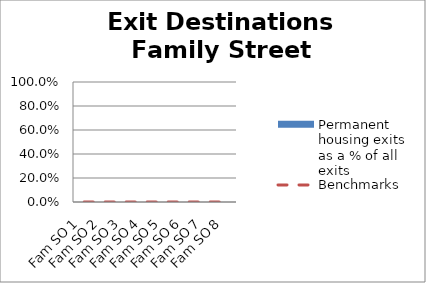
| Category | Permanent housing exits as a % of all exits |
|---|---|
| Fam SO 1 | 0 |
| Fam SO 2 | 0 |
| Fam SO 3 | 0 |
| Fam SO 4 | 0 |
| Fam SO 5 | 0 |
| Fam SO 6 | 0 |
| Fam SO 7 | 0 |
| Fam SO 8 | 0 |